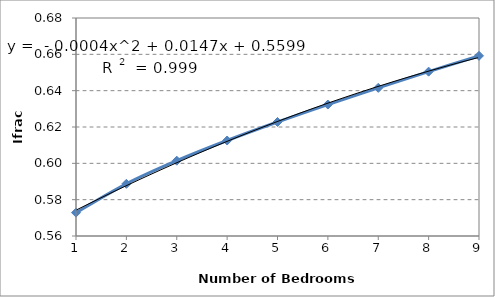
| Category | Series 0 |
|---|---|
| 1.0 | 0.573 |
| 2.0 | 0.589 |
| 3.0 | 0.601 |
| 4.0 | 0.613 |
| 5.0 | 0.623 |
| 6.0 | 0.632 |
| 7.0 | 0.642 |
| 8.0 | 0.65 |
| 9.0 | 0.659 |